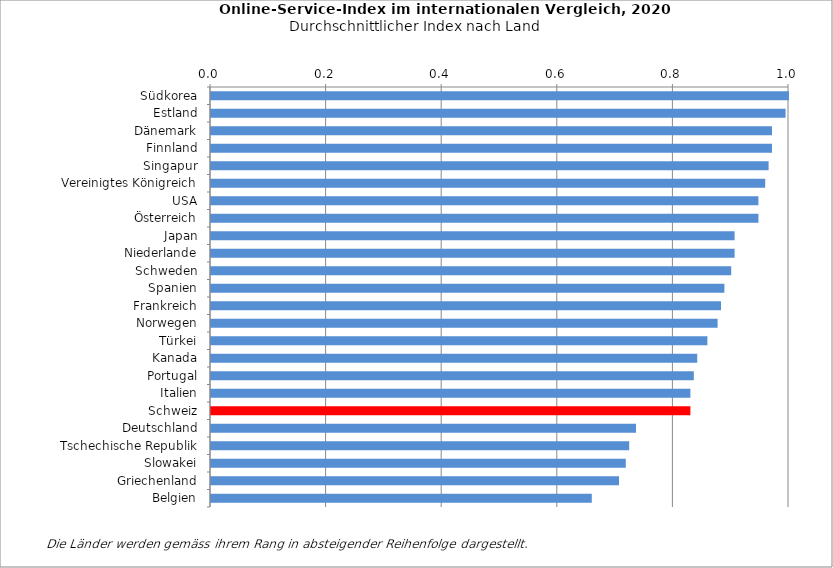
| Category | durchschnittlicher Index |
|---|---|
| Südkorea | 1 |
| Estland | 0.994 |
| Dänemark | 0.971 |
| Finnland | 0.971 |
| Singapur | 0.965 |
| Vereinigtes Königreich | 0.959 |
| USA | 0.947 |
| Österreich | 0.947 |
| Japan | 0.906 |
| Niederlande | 0.906 |
| Schweden | 0.9 |
| Spanien | 0.888 |
| Frankreich | 0.882 |
| Norwegen | 0.876 |
| Türkei | 0.859 |
| Kanada | 0.841 |
| Portugal | 0.835 |
| Italien | 0.829 |
| Schweiz | 0.829 |
| Deutschland | 0.735 |
| Tschechische Republik | 0.724 |
| Slowakei | 0.718 |
| Griechenland | 0.706 |
| Belgien | 0.659 |